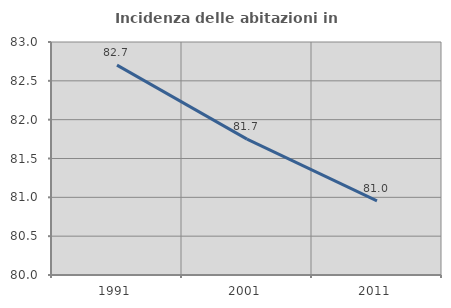
| Category | Incidenza delle abitazioni in proprietà  |
|---|---|
| 1991.0 | 82.702 |
| 2001.0 | 81.749 |
| 2011.0 | 80.955 |